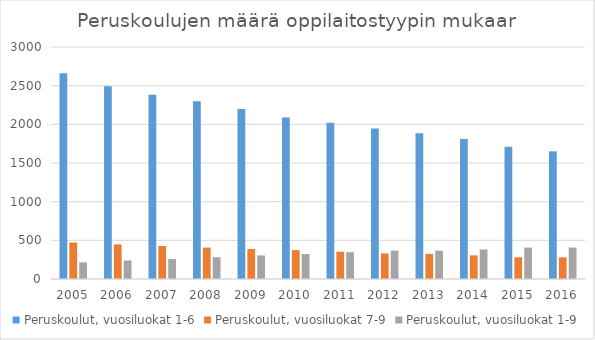
| Category | Peruskoulut, vuosiluokat 1-6 | Peruskoulut, vuosiluokat 7-9 | Peruskoulut, vuosiluokat 1-9 |
|---|---|---|---|
| 2005 | 2660 | 472 | 215 |
| 2006 | 2493 | 447 | 240 |
| 2007 | 2382 | 427 | 258 |
| 2008 | 2300 | 406 | 282 |
| 2009 | 2197 | 388 | 304 |
| 2010 | 2089 | 373 | 323 |
| 2011 | 2020 | 352 | 347 |
| 2012 | 1945 | 331 | 367 |
| 2013 | 1884 | 325 | 366 |
| 2014 | 1811 | 306 | 381 |
| 2015 | 1709 | 281 | 406 |
| 2016 | 1651 | 280 | 407 |